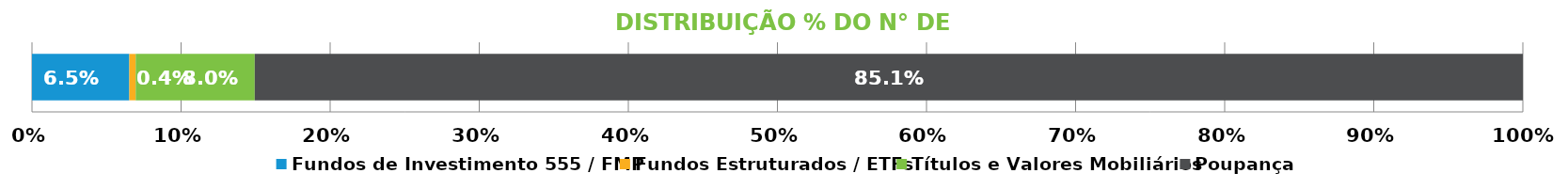
| Category | Fundos de Investimento 555 / FMP | Fundos Estruturados / ETFs | Títulos e Valores Mobiliários | Poupança |
|---|---|---|---|---|
| 0 | 0.065 | 0.004 | 0.08 | 0.851 |